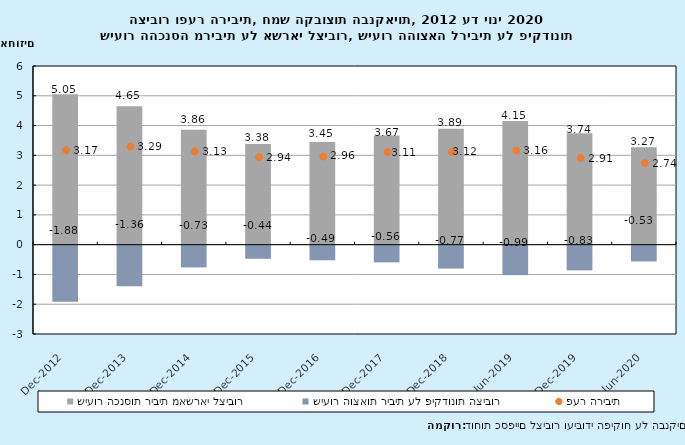
| Category | שיעור הכנסות ריבית מאשראי לציבור | שיעור הוצאות ריבית על פיקדונות הציבור |
|---|---|---|
| 2012-12-31 | 5.05 | -1.88 |
| 2013-12-31 | 4.65 | -1.36 |
| 2014-12-31 | 3.86 | -0.73 |
| 2015-12-31 | 3.38 | -0.44 |
| 2016-12-31 | 3.45 | -0.49 |
| 2017-12-31 | 3.67 | -0.56 |
| 2018-12-31 | 3.89 | -0.77 |
| 2019-06-30 | 4.15 | -0.99 |
| 2019-12-31 | 3.74 | -0.83 |
| 2020-06-30 | 3.27 | -0.53 |